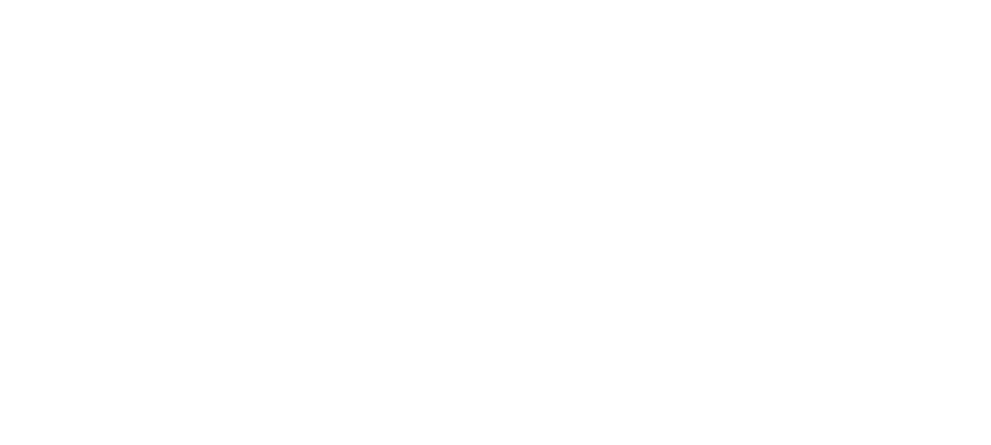
| Category | Grenze 0+ |
|---|---|
| 0 | 0 |
| 1 | 0 |
| 2 | 0 |
| 3 | 0 |
| 4 | 0 |
| 5 | 0 |
| 6 | 0 |
| 7 | 0 |
| 8 | 0 |
| 9 | 0 |
| 10 | 0 |
| 11 | 0 |
| 12 | 0 |
| 13 | 0 |
| 14 | 0 |
| 15 | 0 |
| 16 | 0 |
| 17 | 0 |
| 18 | 0 |
| 19 | 0 |
| 20 | 0 |
| 21 | 0 |
| 22 | 0 |
| 23 | 0 |
| 24 | 0 |
| 25 | 0 |
| 26 | 0 |
| 27 | 0 |
| 28 | 0 |
| 29 | 0 |
| 30 | 0 |
| 31 | 0 |
| 32 | 0 |
| 33 | 0 |
| 34 | 0 |
| 35 | 0 |
| 36 | 0 |
| 37 | 0 |
| 38 | 0 |
| 39 | 0 |
| 40 | 0 |